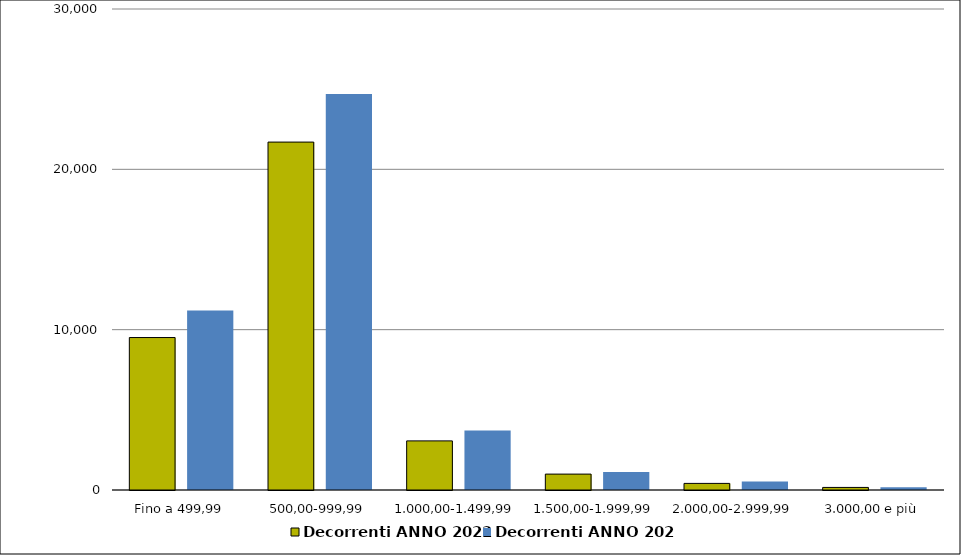
| Category | Decorrenti ANNO 2022 | Decorrenti ANNO 2021 |
|---|---|---|
|  Fino a 499,99  | 9509 | 11199 |
|  500,00-999,99  | 21699 | 24702 |
|  1.000,00-1.499,99  | 3063 | 3718 |
|  1.500,00-1.999,99  | 992 | 1120 |
|  2.000,00-2.999,99  | 412 | 535 |
|  3.000,00 e più  | 160 | 175 |